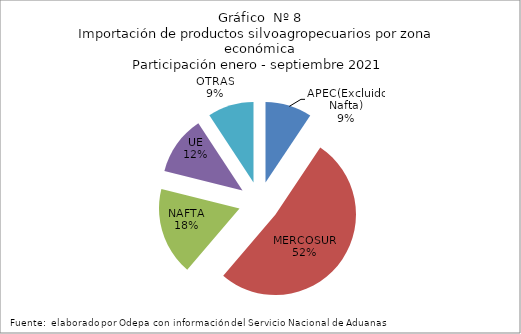
| Category | Series 0 |
|---|---|
| APEC(Excluido Nafta) | 640841.628 |
| MERCOSUR | 3542103.182 |
| NAFTA | 1204719.913 |
| UE | 810987.611 |
| OTRAS | 630976.665 |